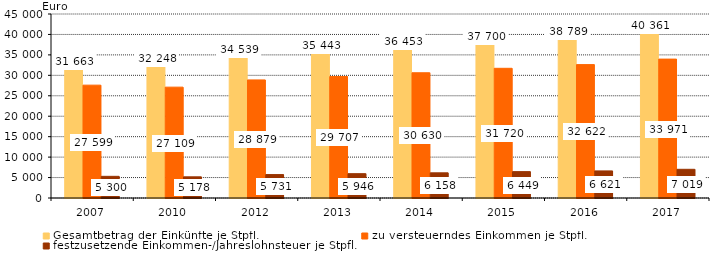
| Category | Gesamtbetrag der Einkünfte je Stpfl. | zu versteuerndes Einkommen je Stpfl. | festzusetzende Einkommen-/Jahreslohnsteuer je Stpfl. |
|---|---|---|---|
| 2007.0 | 31663 | 27599 | 5300 |
| 2010.0 | 32248 | 27109 | 5178 |
| 2012.0 | 34539 | 28879 | 5731 |
| 2013.0 | 35443 | 29707 | 5946 |
| 2014.0 | 36453 | 30630 | 6158 |
| 2015.0 | 37700 | 31720 | 6449 |
| 2016.0 | 38789 | 32622 | 6621 |
| 2017.0 | 40361 | 33971 | 7019 |